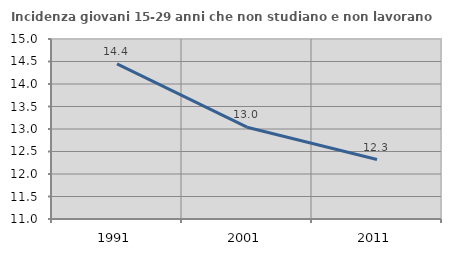
| Category | Incidenza giovani 15-29 anni che non studiano e non lavorano  |
|---|---|
| 1991.0 | 14.448 |
| 2001.0 | 13.04 |
| 2011.0 | 12.321 |